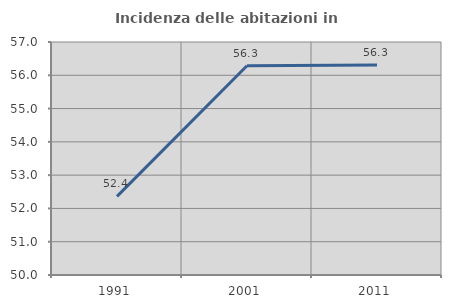
| Category | Incidenza delle abitazioni in proprietà  |
|---|---|
| 1991.0 | 52.361 |
| 2001.0 | 56.286 |
| 2011.0 | 56.305 |